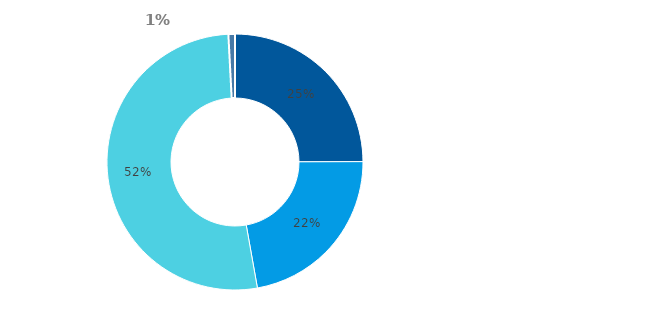
| Category | Series 3 |
|---|---|
| Hotovost | 0.25 |
| Půjčky poskytnuté nemovitostní společnosti | 0.222 |
| Majetkové účasti v nemovitostní společnosti | 0.52 |
| Ostatní finanční aktiva | 0.008 |